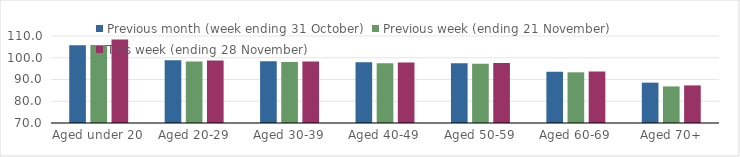
| Category | Previous month (week ending 31 October) | Previous week (ending 21 November) | This week (ending 28 November) |
|---|---|---|---|
| Aged under 20 | 105.75 | 105.84 | 108.36 |
| Aged 20-29 | 98.83 | 98.3 | 98.69 |
| Aged 30-39 | 98.39 | 98.05 | 98.3 |
| Aged 40-49 | 97.95 | 97.45 | 97.79 |
| Aged 50-59 | 97.42 | 97.25 | 97.56 |
| Aged 60-69 | 93.54 | 93.31 | 93.69 |
| Aged 70+ | 88.54 | 86.81 | 87.29 |